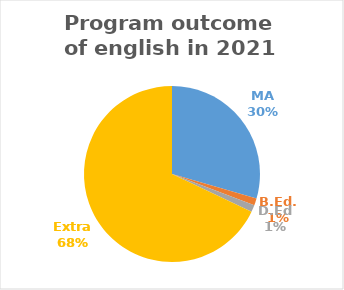
| Category | Series 0 |
|---|---|
| MA | 23 |
| B.Ed. | 1 |
| D.Ed | 1 |
| Extra | 53 |